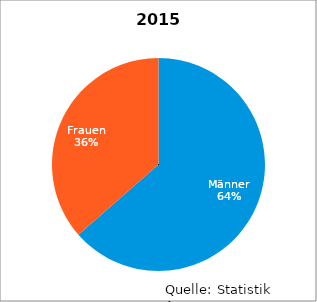
| Category | 2015 |
|---|---|
| Männer | 183 |
| Frauen | 105 |